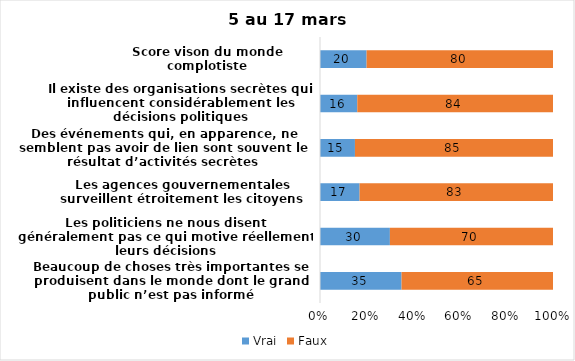
| Category | Vrai | Faux |
|---|---|---|
| Beaucoup de choses très importantes se produisent dans le monde dont le grand public n’est pas informé | 35 | 65 |
| Les politiciens ne nous disent généralement pas ce qui motive réellement leurs décisions | 30 | 70 |
| Les agences gouvernementales surveillent étroitement les citoyens | 17 | 83 |
| Des événements qui, en apparence, ne semblent pas avoir de lien sont souvent le résultat d’activités secrètes | 15 | 85 |
| Il existe des organisations secrètes qui influencent considérablement les décisions politiques | 16 | 84 |
| Score vison du monde complotiste | 20 | 80 |